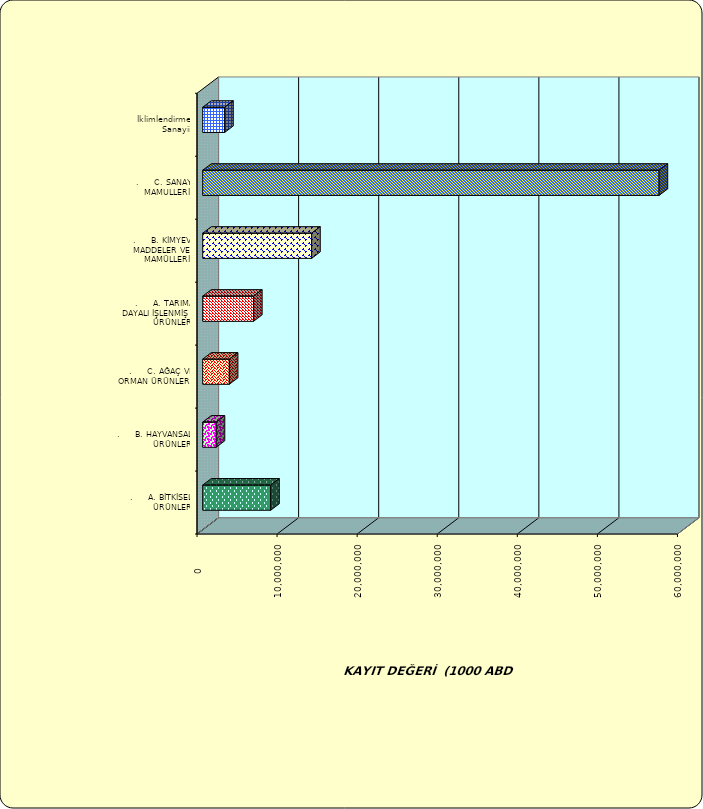
| Category | Series 0 |
|---|---|
| .     A. BİTKİSEL ÜRÜNLER | 8488653.932 |
| .     B. HAYVANSAL ÜRÜNLER | 1683762.434 |
| .     C. AĞAÇ VE ORMAN ÜRÜNLERİ | 3322607.601 |
| .     A. TARIMA DAYALI İŞLENMİŞ ÜRÜNLER | 6346339.049 |
| .     B. KİMYEVİ MADDELER VE MAMÜLLERİ | 13606573.623 |
| .     C. SANAYİ MAMULLERİ | 56994622.953 |
|  İklimlendirme Sanayii | 2743542.494 |